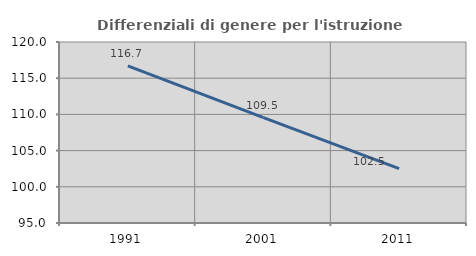
| Category | Differenziali di genere per l'istruzione superiore |
|---|---|
| 1991.0 | 116.71 |
| 2001.0 | 109.543 |
| 2011.0 | 102.519 |